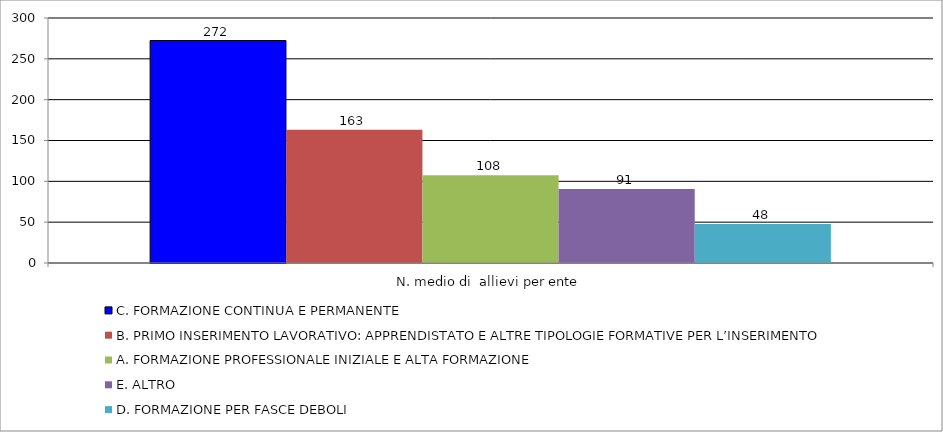
| Category | C. FORMAZIONE CONTINUA E PERMANENTE | B. PRIMO INSERIMENTO LAVORATIVO: APPRENDISTATO E ALTRE TIPOLOGIE FORMATIVE PER L’INSERIMENTO | A. FORMAZIONE PROFESSIONALE INIZIALE E ALTA FORMAZIONE | E. ALTRO | D. FORMAZIONE PER FASCE DEBOLI |
|---|---|---|---|---|---|
| N. medio di  allievi per ente | 272.391 | 163.23 | 107.547 | 90.6 | 47.688 |